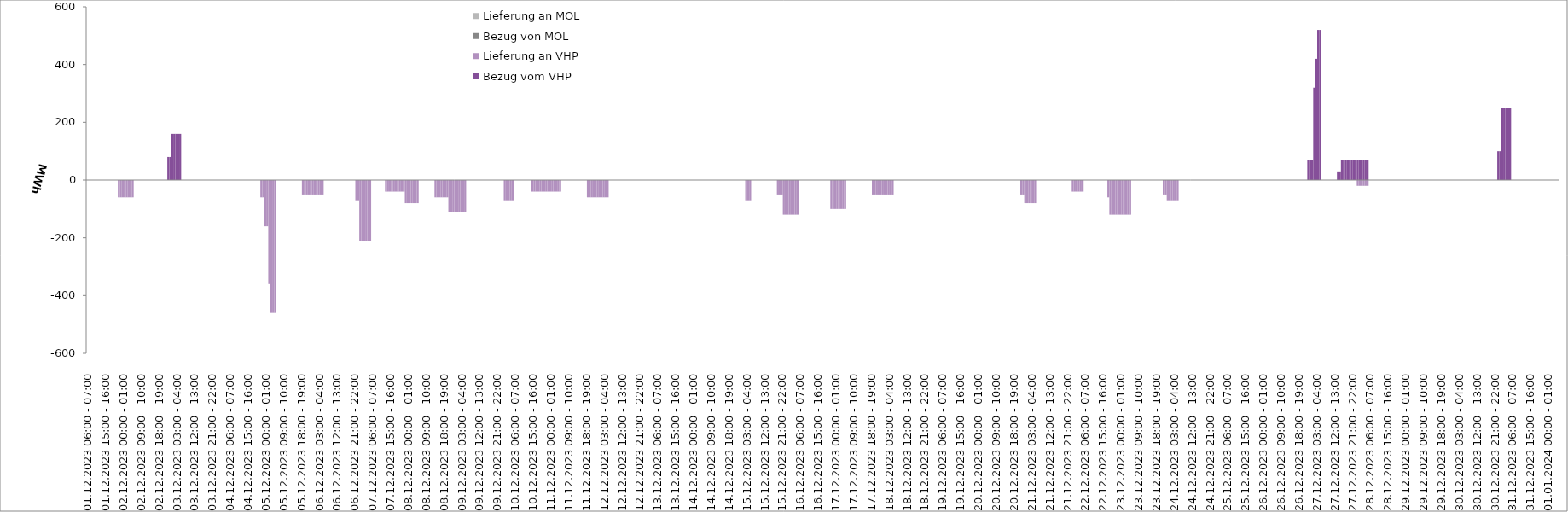
| Category | Bezug vom VHP | Lieferung an VHP | Bezug von MOL | Lieferung an MOL |
|---|---|---|---|---|
| 01.12.2023 06:00 - 07:00 | 0 | 0 | 0 | 0 |
| 01.12.2023 07:00 - 08:00 | 0 | 0 | 0 | 0 |
| 01.12.2023 08:00 - 09:00 | 0 | 0 | 0 | 0 |
| 01.12.2023 09:00 - 10:00 | 0 | 0 | 0 | 0 |
| 01.12.2023 10:00 - 11:00 | 0 | 0 | 0 | 0 |
| 01.12.2023 11:00 - 12:00 | 0 | 0 | 0 | 0 |
| 01.12.2023 12:00 - 13:00 | 0 | 0 | 0 | 0 |
| 01.12.2023 13:00 - 14:00 | 0 | 0 | 0 | 0 |
| 01.12.2023 14:00 - 15:00 | 0 | 0 | 0 | 0 |
| 01.12.2023 15:00 - 16:00 | 0 | 0 | 0 | 0 |
| 01.12.2023 16:00 - 17:00 | 0 | 0 | 0 | 0 |
| 01.12.2023 17:00 - 18:00 | 0 | 0 | 0 | 0 |
| 01.12.2023 18:00 - 19:00 | 0 | 0 | 0 | 0 |
| 01.12.2023 19:00 - 20:00 | 0 | 0 | 0 | 0 |
| 01.12.2023 20:00 - 21:00 | 0 | 0 | 0 | 0 |
| 01.12.2023 21:00 - 22:00 | 0 | 0 | 0 | 0 |
| 01.12.2023 22:00 - 23:00 | 0 | -60 | 0 | 0 |
| 01.12.2023 23:00 - 24:00 | 0 | -60 | 0 | 0 |
| 02.12.2023 00:00 - 01:00 | 0 | -60 | 0 | 0 |
| 02.12.2023 01:00 - 02:00 | 0 | -60 | 0 | 0 |
| 02.12.2023 02:00 - 03:00 | 0 | -60 | 0 | 0 |
| 02.12.2023 03:00 - 04:00 | 0 | -60 | 0 | 0 |
| 02.12.2023 04:00 - 05:00 | 0 | -60 | 0 | 0 |
| 02.12.2023 05:00 - 06:00 | 0 | -60 | 0 | 0 |
| 02.12.2023 06:00 - 07:00 | 0 | 0 | 0 | 0 |
| 02.12.2023 07:00 - 08:00 | 0 | 0 | 0 | 0 |
| 02.12.2023 08:00 - 09:00 | 0 | 0 | 0 | 0 |
| 02.12.2023 09:00 - 10:00 | 0 | 0 | 0 | 0 |
| 02.12.2023 10:00 - 11:00 | 0 | 0 | 0 | 0 |
| 02.12.2023 11:00 - 12:00 | 0 | 0 | 0 | 0 |
| 02.12.2023 12:00 - 13:00 | 0 | 0 | 0 | 0 |
| 02.12.2023 13:00 - 14:00 | 0 | 0 | 0 | 0 |
| 02.12.2023 14:00 - 15:00 | 0 | 0 | 0 | 0 |
| 02.12.2023 15:00 - 16:00 | 0 | 0 | 0 | 0 |
| 02.12.2023 16:00 - 17:00 | 0 | 0 | 0 | 0 |
| 02.12.2023 17:00 - 18:00 | 0 | 0 | 0 | 0 |
| 02.12.2023 18:00 - 19:00 | 0 | 0 | 0 | 0 |
| 02.12.2023 19:00 - 20:00 | 0 | 0 | 0 | 0 |
| 02.12.2023 20:00 - 21:00 | 0 | 0 | 0 | 0 |
| 02.12.2023 21:00 - 22:00 | 0 | 0 | 0 | 0 |
| 02.12.2023 22:00 - 23:00 | 0 | 0 | 0 | 0 |
| 02.12.2023 23:00 - 24:00 | 80 | 0 | 0 | 0 |
| 03.12.2023 00:00 - 01:00 | 80 | 0 | 0 | 0 |
| 03.12.2023 01:00 - 02:00 | 160 | 0 | 0 | 0 |
| 03.12.2023 02:00 - 03:00 | 160 | 0 | 0 | 0 |
| 03.12.2023 03:00 - 04:00 | 160 | 0 | 0 | 0 |
| 03.12.2023 04:00 - 05:00 | 160 | 0 | 0 | 0 |
| 03.12.2023 05:00 - 06:00 | 160 | 0 | 0 | 0 |
| 03.12.2023 06:00 - 07:00 | 0 | 0 | 0 | 0 |
| 03.12.2023 07:00 - 08:00 | 0 | 0 | 0 | 0 |
| 03.12.2023 08:00 - 09:00 | 0 | 0 | 0 | 0 |
| 03.12.2023 09:00 - 10:00 | 0 | 0 | 0 | 0 |
| 03.12.2023 10:00 - 11:00 | 0 | 0 | 0 | 0 |
| 03.12.2023 11:00 - 12:00 | 0 | 0 | 0 | 0 |
| 03.12.2023 12:00 - 13:00 | 0 | 0 | 0 | 0 |
| 03.12.2023 13:00 - 14:00 | 0 | 0 | 0 | 0 |
| 03.12.2023 14:00 - 15:00 | 0 | 0 | 0 | 0 |
| 03.12.2023 15:00 - 16:00 | 0 | 0 | 0 | 0 |
| 03.12.2023 16:00 - 17:00 | 0 | 0 | 0 | 0 |
| 03.12.2023 17:00 - 18:00 | 0 | 0 | 0 | 0 |
| 03.12.2023 18:00 - 19:00 | 0 | 0 | 0 | 0 |
| 03.12.2023 19:00 - 20:00 | 0 | 0 | 0 | 0 |
| 03.12.2023 20:00 - 21:00 | 0 | 0 | 0 | 0 |
| 03.12.2023 21:00 - 22:00 | 0 | 0 | 0 | 0 |
| 03.12.2023 22:00 - 23:00 | 0 | 0 | 0 | 0 |
| 03.12.2023 23:00 - 24:00 | 0 | 0 | 0 | 0 |
| 04.12.2023 00:00 - 01:00 | 0 | 0 | 0 | 0 |
| 04.12.2023 01:00 - 02:00 | 0 | 0 | 0 | 0 |
| 04.12.2023 02:00 - 03:00 | 0 | 0 | 0 | 0 |
| 04.12.2023 03:00 - 04:00 | 0 | 0 | 0 | 0 |
| 04.12.2023 04:00 - 05:00 | 0 | 0 | 0 | 0 |
| 04.12.2023 05:00 - 06:00 | 0 | 0 | 0 | 0 |
| 04.12.2023 06:00 - 07:00 | 0 | 0 | 0 | 0 |
| 04.12.2023 07:00 - 08:00 | 0 | 0 | 0 | 0 |
| 04.12.2023 08:00 - 09:00 | 0 | 0 | 0 | 0 |
| 04.12.2023 09:00 - 10:00 | 0 | 0 | 0 | 0 |
| 04.12.2023 10:00 - 11:00 | 0 | 0 | 0 | 0 |
| 04.12.2023 11:00 - 12:00 | 0 | 0 | 0 | 0 |
| 04.12.2023 12:00 - 13:00 | 0 | 0 | 0 | 0 |
| 04.12.2023 13:00 - 14:00 | 0 | 0 | 0 | 0 |
| 04.12.2023 14:00 - 15:00 | 0 | 0 | 0 | 0 |
| 04.12.2023 15:00 - 16:00 | 0 | 0 | 0 | 0 |
| 04.12.2023 16:00 - 17:00 | 0 | 0 | 0 | 0 |
| 04.12.2023 17:00 - 18:00 | 0 | 0 | 0 | 0 |
| 04.12.2023 18:00 - 19:00 | 0 | 0 | 0 | 0 |
| 04.12.2023 19:00 - 20:00 | 0 | 0 | 0 | 0 |
| 04.12.2023 20:00 - 21:00 | 0 | 0 | 0 | 0 |
| 04.12.2023 21:00 - 22:00 | 0 | 0 | 0 | 0 |
| 04.12.2023 22:00 - 23:00 | 0 | -60 | 0 | 0 |
| 04.12.2023 23:00 - 24:00 | 0 | -60 | 0 | 0 |
| 05.12.2023 00:00 - 01:00 | 0 | -160 | 0 | 0 |
| 05.12.2023 01:00 - 02:00 | 0 | -160 | 0 | 0 |
| 05.12.2023 02:00 - 03:00 | 0 | -360 | 0 | 0 |
| 05.12.2023 03:00 - 04:00 | 0 | -460 | 0 | 0 |
| 05.12.2023 04:00 - 05:00 | 0 | -460 | 0 | 0 |
| 05.12.2023 05:00 - 06:00 | 0 | -460 | 0 | 0 |
| 05.12.2023 06:00 - 07:00 | 0 | 0 | 0 | 0 |
| 05.12.2023 07:00 - 08:00 | 0 | 0 | 0 | 0 |
| 05.12.2023 08:00 - 09:00 | 0 | 0 | 0 | 0 |
| 05.12.2023 09:00 - 10:00 | 0 | 0 | 0 | 0 |
| 05.12.2023 10:00 - 11:00 | 0 | 0 | 0 | 0 |
| 05.12.2023 11:00 - 12:00 | 0 | 0 | 0 | 0 |
| 05.12.2023 12:00 - 13:00 | 0 | 0 | 0 | 0 |
| 05.12.2023 13:00 - 14:00 | 0 | 0 | 0 | 0 |
| 05.12.2023 14:00 - 15:00 | 0 | 0 | 0 | 0 |
| 05.12.2023 15:00 - 16:00 | 0 | 0 | 0 | 0 |
| 05.12.2023 16:00 - 17:00 | 0 | 0 | 0 | 0 |
| 05.12.2023 17:00 - 18:00 | 0 | 0 | 0 | 0 |
| 05.12.2023 18:00 - 19:00 | 0 | 0 | 0 | 0 |
| 05.12.2023 19:00 - 20:00 | 0 | -50 | 0 | 0 |
| 05.12.2023 20:00 - 21:00 | 0 | -50 | 0 | 0 |
| 05.12.2023 21:00 - 22:00 | 0 | -50 | 0 | 0 |
| 05.12.2023 22:00 - 23:00 | 0 | -50 | 0 | 0 |
| 05.12.2023 23:00 - 24:00 | 0 | -50 | 0 | 0 |
| 06.12.2023 00:00 - 01:00 | 0 | -50 | 0 | 0 |
| 06.12.2023 01:00 - 02:00 | 0 | -50 | 0 | 0 |
| 06.12.2023 02:00 - 03:00 | 0 | -50 | 0 | 0 |
| 06.12.2023 03:00 - 04:00 | 0 | -50 | 0 | 0 |
| 06.12.2023 04:00 - 05:00 | 0 | -50 | 0 | 0 |
| 06.12.2023 05:00 - 06:00 | 0 | -50 | 0 | 0 |
| 06.12.2023 06:00 - 07:00 | 0 | 0 | 0 | 0 |
| 06.12.2023 07:00 - 08:00 | 0 | 0 | 0 | 0 |
| 06.12.2023 08:00 - 09:00 | 0 | 0 | 0 | 0 |
| 06.12.2023 09:00 - 10:00 | 0 | 0 | 0 | 0 |
| 06.12.2023 10:00 - 11:00 | 0 | 0 | 0 | 0 |
| 06.12.2023 11:00 - 12:00 | 0 | 0 | 0 | 0 |
| 06.12.2023 12:00 - 13:00 | 0 | 0 | 0 | 0 |
| 06.12.2023 13:00 - 14:00 | 0 | 0 | 0 | 0 |
| 06.12.2023 14:00 - 15:00 | 0 | 0 | 0 | 0 |
| 06.12.2023 15:00 - 16:00 | 0 | 0 | 0 | 0 |
| 06.12.2023 16:00 - 17:00 | 0 | 0 | 0 | 0 |
| 06.12.2023 17:00 - 18:00 | 0 | 0 | 0 | 0 |
| 06.12.2023 18:00 - 19:00 | 0 | 0 | 0 | 0 |
| 06.12.2023 19:00 - 20:00 | 0 | 0 | 0 | 0 |
| 06.12.2023 20:00 - 21:00 | 0 | 0 | 0 | 0 |
| 06.12.2023 21:00 - 22:00 | 0 | 0 | 0 | 0 |
| 06.12.2023 22:00 - 23:00 | 0 | -70 | 0 | 0 |
| 06.12.2023 23:00 - 24:00 | 0 | -70 | 0 | 0 |
| 07.12.2023 00:00 - 01:00 | 0 | -210 | 0 | 0 |
| 07.12.2023 01:00 - 02:00 | 0 | -210 | 0 | 0 |
| 07.12.2023 02:00 - 03:00 | 0 | -210 | 0 | 0 |
| 07.12.2023 03:00 - 04:00 | 0 | -210 | 0 | 0 |
| 07.12.2023 04:00 - 05:00 | 0 | -210 | 0 | 0 |
| 07.12.2023 05:00 - 06:00 | 0 | -210 | 0 | 0 |
| 07.12.2023 06:00 - 07:00 | 0 | 0 | 0 | 0 |
| 07.12.2023 07:00 - 08:00 | 0 | 0 | 0 | 0 |
| 07.12.2023 08:00 - 09:00 | 0 | 0 | 0 | 0 |
| 07.12.2023 09:00 - 10:00 | 0 | 0 | 0 | 0 |
| 07.12.2023 10:00 - 11:00 | 0 | 0 | 0 | 0 |
| 07.12.2023 11:00 - 12:00 | 0 | 0 | 0 | 0 |
| 07.12.2023 12:00 - 13:00 | 0 | 0 | 0 | 0 |
| 07.12.2023 13:00 - 14:00 | 0 | -40 | 0 | 0 |
| 07.12.2023 14:00 - 15:00 | 0 | -40 | 0 | 0 |
| 07.12.2023 15:00 - 16:00 | 0 | -40 | 0 | 0 |
| 07.12.2023 16:00 - 17:00 | 0 | -40 | 0 | 0 |
| 07.12.2023 17:00 - 18:00 | 0 | -40 | 0 | 0 |
| 07.12.2023 18:00 - 19:00 | 0 | -40 | 0 | 0 |
| 07.12.2023 19:00 - 20:00 | 0 | -40 | 0 | 0 |
| 07.12.2023 20:00 - 21:00 | 0 | -40 | 0 | 0 |
| 07.12.2023 21:00 - 22:00 | 0 | -40 | 0 | 0 |
| 07.12.2023 22:00 - 23:00 | 0 | -40 | 0 | 0 |
| 07.12.2023 23:00 - 24:00 | 0 | -80 | 0 | 0 |
| 08.12.2023 00:00 - 01:00 | 0 | -80 | 0 | 0 |
| 08.12.2023 01:00 - 02:00 | 0 | -80 | 0 | 0 |
| 08.12.2023 02:00 - 03:00 | 0 | -80 | 0 | 0 |
| 08.12.2023 03:00 - 04:00 | 0 | -80 | 0 | 0 |
| 08.12.2023 04:00 - 05:00 | 0 | -80 | 0 | 0 |
| 08.12.2023 05:00 - 06:00 | 0 | -80 | 0 | 0 |
| 08.12.2023 06:00 - 07:00 | 0 | 0 | 0 | 0 |
| 08.12.2023 07:00 - 08:00 | 0 | 0 | 0 | 0 |
| 08.12.2023 08:00 - 09:00 | 0 | 0 | 0 | 0 |
| 08.12.2023 09:00 - 10:00 | 0 | 0 | 0 | 0 |
| 08.12.2023 10:00 - 11:00 | 0 | 0 | 0 | 0 |
| 08.12.2023 11:00 - 12:00 | 0 | 0 | 0 | 0 |
| 08.12.2023 12:00 - 13:00 | 0 | 0 | 0 | 0 |
| 08.12.2023 13:00 - 14:00 | 0 | 0 | 0 | 0 |
| 08.12.2023 14:00 - 15:00 | 0 | -60 | 0 | 0 |
| 08.12.2023 15:00 - 16:00 | 0 | -60 | 0 | 0 |
| 08.12.2023 16:00 - 17:00 | 0 | -60 | 0 | 0 |
| 08.12.2023 17:00 - 18:00 | 0 | -60 | 0 | 0 |
| 08.12.2023 18:00 - 19:00 | 0 | -60 | 0 | 0 |
| 08.12.2023 19:00 - 20:00 | 0 | -60 | 0 | 0 |
| 08.12.2023 20:00 - 21:00 | 0 | -60 | 0 | 0 |
| 08.12.2023 21:00 - 22:00 | 0 | -110 | 0 | 0 |
| 08.12.2023 22:00 - 23:00 | 0 | -110 | 0 | 0 |
| 08.12.2023 23:00 - 24:00 | 0 | -110 | 0 | 0 |
| 09.12.2023 00:00 - 01:00 | 0 | -110 | 0 | 0 |
| 09.12.2023 01:00 - 02:00 | 0 | -110 | 0 | 0 |
| 09.12.2023 02:00 - 03:00 | 0 | -110 | 0 | 0 |
| 09.12.2023 03:00 - 04:00 | 0 | -110 | 0 | 0 |
| 09.12.2023 04:00 - 05:00 | 0 | -110 | 0 | 0 |
| 09.12.2023 05:00 - 06:00 | 0 | -110 | 0 | 0 |
| 09.12.2023 06:00 - 07:00 | 0 | 0 | 0 | 0 |
| 09.12.2023 07:00 - 08:00 | 0 | 0 | 0 | 0 |
| 09.12.2023 08:00 - 09:00 | 0 | 0 | 0 | 0 |
| 09.12.2023 09:00 - 10:00 | 0 | 0 | 0 | 0 |
| 09.12.2023 10:00 - 11:00 | 0 | 0 | 0 | 0 |
| 09.12.2023 11:00 - 12:00 | 0 | 0 | 0 | 0 |
| 09.12.2023 12:00 - 13:00 | 0 | 0 | 0 | 0 |
| 09.12.2023 13:00 - 14:00 | 0 | 0 | 0 | 0 |
| 09.12.2023 14:00 - 15:00 | 0 | 0 | 0 | 0 |
| 09.12.2023 15:00 - 16:00 | 0 | 0 | 0 | 0 |
| 09.12.2023 16:00 - 17:00 | 0 | 0 | 0 | 0 |
| 09.12.2023 17:00 - 18:00 | 0 | 0 | 0 | 0 |
| 09.12.2023 18:00 - 19:00 | 0 | 0 | 0 | 0 |
| 09.12.2023 19:00 - 20:00 | 0 | 0 | 0 | 0 |
| 09.12.2023 20:00 - 21:00 | 0 | 0 | 0 | 0 |
| 09.12.2023 21:00 - 22:00 | 0 | 0 | 0 | 0 |
| 09.12.2023 22:00 - 23:00 | 0 | 0 | 0 | 0 |
| 09.12.2023 23:00 - 24:00 | 0 | 0 | 0 | 0 |
| 10.12.2023 00:00 - 01:00 | 0 | 0 | 0 | 0 |
| 10.12.2023 01:00 - 02:00 | 0 | -70 | 0 | 0 |
| 10.12.2023 02:00 - 03:00 | 0 | -70 | 0 | 0 |
| 10.12.2023 03:00 - 04:00 | 0 | -70 | 0 | 0 |
| 10.12.2023 04:00 - 05:00 | 0 | -70 | 0 | 0 |
| 10.12.2023 05:00 - 06:00 | 0 | -70 | 0 | 0 |
| 10.12.2023 06:00 - 07:00 | 0 | 0 | 0 | 0 |
| 10.12.2023 07:00 - 08:00 | 0 | 0 | 0 | 0 |
| 10.12.2023 08:00 - 09:00 | 0 | 0 | 0 | 0 |
| 10.12.2023 09:00 - 10:00 | 0 | 0 | 0 | 0 |
| 10.12.2023 10:00 - 11:00 | 0 | 0 | 0 | 0 |
| 10.12.2023 11:00 - 12:00 | 0 | 0 | 0 | 0 |
| 10.12.2023 12:00 - 13:00 | 0 | 0 | 0 | 0 |
| 10.12.2023 13:00 - 14:00 | 0 | 0 | 0 | 0 |
| 10.12.2023 14:00 - 15:00 | 0 | 0 | 0 | 0 |
| 10.12.2023 15:00 - 16:00 | 0 | -40 | 0 | 0 |
| 10.12.2023 16:00 - 17:00 | 0 | -40 | 0 | 0 |
| 10.12.2023 17:00 - 18:00 | 0 | -40 | 0 | 0 |
| 10.12.2023 18:00 - 19:00 | 0 | -40 | 0 | 0 |
| 10.12.2023 19:00 - 20:00 | 0 | -40 | 0 | 0 |
| 10.12.2023 20:00 - 21:00 | 0 | -40 | 0 | 0 |
| 10.12.2023 21:00 - 22:00 | 0 | -40 | 0 | 0 |
| 10.12.2023 22:00 - 23:00 | 0 | -40 | 0 | 0 |
| 10.12.2023 23:00 - 24:00 | 0 | -40 | 0 | 0 |
| 11.12.2023 00:00 - 01:00 | 0 | -40 | 0 | 0 |
| 11.12.2023 01:00 - 02:00 | 0 | -40 | 0 | 0 |
| 11.12.2023 02:00 - 03:00 | 0 | -40 | 0 | 0 |
| 11.12.2023 03:00 - 04:00 | 0 | -40 | 0 | 0 |
| 11.12.2023 04:00 - 05:00 | 0 | -40 | 0 | 0 |
| 11.12.2023 05:00 - 06:00 | 0 | -40 | 0 | 0 |
| 11.12.2023 06:00 - 07:00 | 0 | 0 | 0 | 0 |
| 11.12.2023 07:00 - 08:00 | 0 | 0 | 0 | 0 |
| 11.12.2023 08:00 - 09:00 | 0 | 0 | 0 | 0 |
| 11.12.2023 09:00 - 10:00 | 0 | 0 | 0 | 0 |
| 11.12.2023 10:00 - 11:00 | 0 | 0 | 0 | 0 |
| 11.12.2023 11:00 - 12:00 | 0 | 0 | 0 | 0 |
| 11.12.2023 12:00 - 13:00 | 0 | 0 | 0 | 0 |
| 11.12.2023 13:00 - 14:00 | 0 | 0 | 0 | 0 |
| 11.12.2023 14:00 - 15:00 | 0 | 0 | 0 | 0 |
| 11.12.2023 15:00 - 16:00 | 0 | 0 | 0 | 0 |
| 11.12.2023 16:00 - 17:00 | 0 | 0 | 0 | 0 |
| 11.12.2023 17:00 - 18:00 | 0 | 0 | 0 | 0 |
| 11.12.2023 18:00 - 19:00 | 0 | 0 | 0 | 0 |
| 11.12.2023 19:00 - 20:00 | 0 | -60 | 0 | 0 |
| 11.12.2023 20:00 - 21:00 | 0 | -60 | 0 | 0 |
| 11.12.2023 21:00 - 22:00 | 0 | -60 | 0 | 0 |
| 11.12.2023 22:00 - 23:00 | 0 | -60 | 0 | 0 |
| 11.12.2023 23:00 - 24:00 | 0 | -60 | 0 | 0 |
| 12.12.2023 00:00 - 01:00 | 0 | -60 | 0 | 0 |
| 12.12.2023 01:00 - 02:00 | 0 | -60 | 0 | 0 |
| 12.12.2023 02:00 - 03:00 | 0 | -60 | 0 | 0 |
| 12.12.2023 03:00 - 04:00 | 0 | -60 | 0 | 0 |
| 12.12.2023 04:00 - 05:00 | 0 | -60 | 0 | 0 |
| 12.12.2023 05:00 - 06:00 | 0 | -60 | 0 | 0 |
| 12.12.2023 06:00 - 07:00 | 0 | 0 | 0 | 0 |
| 12.12.2023 07:00 - 08:00 | 0 | 0 | 0 | 0 |
| 12.12.2023 08:00 - 09:00 | 0 | 0 | 0 | 0 |
| 12.12.2023 09:00 - 10:00 | 0 | 0 | 0 | 0 |
| 12.12.2023 10:00 - 11:00 | 0 | 0 | 0 | 0 |
| 12.12.2023 11:00 - 12:00 | 0 | 0 | 0 | 0 |
| 12.12.2023 12:00 - 13:00 | 0 | 0 | 0 | 0 |
| 12.12.2023 13:00 - 14:00 | 0 | 0 | 0 | 0 |
| 12.12.2023 14:00 - 15:00 | 0 | 0 | 0 | 0 |
| 12.12.2023 15:00 - 16:00 | 0 | 0 | 0 | 0 |
| 12.12.2023 16:00 - 17:00 | 0 | 0 | 0 | 0 |
| 12.12.2023 17:00 - 18:00 | 0 | 0 | 0 | 0 |
| 12.12.2023 18:00 - 19:00 | 0 | 0 | 0 | 0 |
| 12.12.2023 19:00 - 20:00 | 0 | 0 | 0 | 0 |
| 12.12.2023 20:00 - 21:00 | 0 | 0 | 0 | 0 |
| 12.12.2023 21:00 - 22:00 | 0 | 0 | 0 | 0 |
| 12.12.2023 22:00 - 23:00 | 0 | 0 | 0 | 0 |
| 12.12.2023 23:00 - 24:00 | 0 | 0 | 0 | 0 |
| 13.12.2023 00:00 - 01:00 | 0 | 0 | 0 | 0 |
| 13.12.2023 01:00 - 02:00 | 0 | 0 | 0 | 0 |
| 13.12.2023 02:00 - 03:00 | 0 | 0 | 0 | 0 |
| 13.12.2023 03:00 - 04:00 | 0 | 0 | 0 | 0 |
| 13.12.2023 04:00 - 05:00 | 0 | 0 | 0 | 0 |
| 13.12.2023 05:00 - 06:00 | 0 | 0 | 0 | 0 |
| 13.12.2023 06:00 - 07:00 | 0 | 0 | 0 | 0 |
| 13.12.2023 07:00 - 08:00 | 0 | 0 | 0 | 0 |
| 13.12.2023 08:00 - 09:00 | 0 | 0 | 0 | 0 |
| 13.12.2023 09:00 - 10:00 | 0 | 0 | 0 | 0 |
| 13.12.2023 10:00 - 11:00 | 0 | 0 | 0 | 0 |
| 13.12.2023 11:00 - 12:00 | 0 | 0 | 0 | 0 |
| 13.12.2023 12:00 - 13:00 | 0 | 0 | 0 | 0 |
| 13.12.2023 13:00 - 14:00 | 0 | 0 | 0 | 0 |
| 13.12.2023 14:00 - 15:00 | 0 | 0 | 0 | 0 |
| 13.12.2023 15:00 - 16:00 | 0 | 0 | 0 | 0 |
| 13.12.2023 16:00 - 17:00 | 0 | 0 | 0 | 0 |
| 13.12.2023 17:00 - 18:00 | 0 | 0 | 0 | 0 |
| 13.12.2023 18:00 - 19:00 | 0 | 0 | 0 | 0 |
| 13.12.2023 19:00 - 20:00 | 0 | 0 | 0 | 0 |
| 13.12.2023 20:00 - 21:00 | 0 | 0 | 0 | 0 |
| 13.12.2023 21:00 - 22:00 | 0 | 0 | 0 | 0 |
| 13.12.2023 22:00 - 23:00 | 0 | 0 | 0 | 0 |
| 13.12.2023 23:00 - 24:00 | 0 | 0 | 0 | 0 |
| 14.12.2023 00:00 - 01:00 | 0 | 0 | 0 | 0 |
| 14.12.2023 01:00 - 02:00 | 0 | 0 | 0 | 0 |
| 14.12.2023 02:00 - 03:00 | 0 | 0 | 0 | 0 |
| 14.12.2023 03:00 - 04:00 | 0 | 0 | 0 | 0 |
| 14.12.2023 04:00 - 05:00 | 0 | 0 | 0 | 0 |
| 14.12.2023 05:00 - 06:00 | 0 | 0 | 0 | 0 |
| 14.12.2023 06:00 - 07:00 | 0 | 0 | 0 | 0 |
| 14.12.2023 07:00 - 08:00 | 0 | 0 | 0 | 0 |
| 14.12.2023 08:00 - 09:00 | 0 | 0 | 0 | 0 |
| 14.12.2023 09:00 - 10:00 | 0 | 0 | 0 | 0 |
| 14.12.2023 10:00 - 11:00 | 0 | 0 | 0 | 0 |
| 14.12.2023 11:00 - 12:00 | 0 | 0 | 0 | 0 |
| 14.12.2023 12:00 - 13:00 | 0 | 0 | 0 | 0 |
| 14.12.2023 13:00 - 14:00 | 0 | 0 | 0 | 0 |
| 14.12.2023 14:00 - 15:00 | 0 | 0 | 0 | 0 |
| 14.12.2023 15:00 - 16:00 | 0 | 0 | 0 | 0 |
| 14.12.2023 16:00 - 17:00 | 0 | 0 | 0 | 0 |
| 14.12.2023 17:00 - 18:00 | 0 | 0 | 0 | 0 |
| 14.12.2023 18:00 - 19:00 | 0 | 0 | 0 | 0 |
| 14.12.2023 19:00 - 20:00 | 0 | 0 | 0 | 0 |
| 14.12.2023 20:00 - 21:00 | 0 | 0 | 0 | 0 |
| 14.12.2023 21:00 - 22:00 | 0 | 0 | 0 | 0 |
| 14.12.2023 22:00 - 23:00 | 0 | 0 | 0 | 0 |
| 14.12.2023 23:00 - 24:00 | 0 | 0 | 0 | 0 |
| 15.12.2023 00:00 - 01:00 | 0 | 0 | 0 | 0 |
| 15.12.2023 01:00 - 02:00 | 0 | 0 | 0 | 0 |
| 15.12.2023 02:00 - 03:00 | 0 | 0 | 0 | 0 |
| 15.12.2023 03:00 - 04:00 | 0 | -70 | 0 | 0 |
| 15.12.2023 04:00 - 05:00 | 0 | -70 | 0 | 0 |
| 15.12.2023 05:00 - 06:00 | 0 | -70 | 0 | 0 |
| 15.12.2023 06:00 - 07:00 | 0 | 0 | 0 | 0 |
| 15.12.2023 07:00 - 08:00 | 0 | 0 | 0 | 0 |
| 15.12.2023 08:00 - 09:00 | 0 | 0 | 0 | 0 |
| 15.12.2023 09:00 - 10:00 | 0 | 0 | 0 | 0 |
| 15.12.2023 10:00 - 11:00 | 0 | 0 | 0 | 0 |
| 15.12.2023 11:00 - 12:00 | 0 | 0 | 0 | 0 |
| 15.12.2023 12:00 - 13:00 | 0 | 0 | 0 | 0 |
| 15.12.2023 13:00 - 14:00 | 0 | 0 | 0 | 0 |
| 15.12.2023 14:00 - 15:00 | 0 | 0 | 0 | 0 |
| 15.12.2023 15:00 - 16:00 | 0 | 0 | 0 | 0 |
| 15.12.2023 16:00 - 17:00 | 0 | 0 | 0 | 0 |
| 15.12.2023 17:00 - 18:00 | 0 | 0 | 0 | 0 |
| 15.12.2023 18:00 - 19:00 | 0 | 0 | 0 | 0 |
| 15.12.2023 19:00 - 20:00 | 0 | -50 | 0 | 0 |
| 15.12.2023 20:00 - 21:00 | 0 | -50 | 0 | 0 |
| 15.12.2023 21:00 - 22:00 | 0 | -50 | 0 | 0 |
| 15.12.2023 22:00 - 23:00 | 0 | -120 | 0 | 0 |
| 15.12.2023 23:00 - 24:00 | 0 | -120 | 0 | 0 |
| 16.12.2023 00:00 - 01:00 | 0 | -120 | 0 | 0 |
| 16.12.2023 01:00 - 02:00 | 0 | -120 | 0 | 0 |
| 16.12.2023 02:00 - 03:00 | 0 | -120 | 0 | 0 |
| 16.12.2023 03:00 - 04:00 | 0 | -120 | 0 | 0 |
| 16.12.2023 04:00 - 05:00 | 0 | -120 | 0 | 0 |
| 16.12.2023 05:00 - 06:00 | 0 | -120 | 0 | 0 |
| 16.12.2023 06:00 - 07:00 | 0 | 0 | 0 | 0 |
| 16.12.2023 07:00 - 08:00 | 0 | 0 | 0 | 0 |
| 16.12.2023 08:00 - 09:00 | 0 | 0 | 0 | 0 |
| 16.12.2023 09:00 - 10:00 | 0 | 0 | 0 | 0 |
| 16.12.2023 10:00 - 11:00 | 0 | 0 | 0 | 0 |
| 16.12.2023 11:00 - 12:00 | 0 | 0 | 0 | 0 |
| 16.12.2023 12:00 - 13:00 | 0 | 0 | 0 | 0 |
| 16.12.2023 13:00 - 14:00 | 0 | 0 | 0 | 0 |
| 16.12.2023 14:00 - 15:00 | 0 | 0 | 0 | 0 |
| 16.12.2023 15:00 - 16:00 | 0 | 0 | 0 | 0 |
| 16.12.2023 16:00 - 17:00 | 0 | 0 | 0 | 0 |
| 16.12.2023 17:00 - 18:00 | 0 | 0 | 0 | 0 |
| 16.12.2023 18:00 - 19:00 | 0 | 0 | 0 | 0 |
| 16.12.2023 19:00 - 20:00 | 0 | 0 | 0 | 0 |
| 16.12.2023 20:00 - 21:00 | 0 | 0 | 0 | 0 |
| 16.12.2023 21:00 - 22:00 | 0 | 0 | 0 | 0 |
| 16.12.2023 22:00 - 23:00 | 0 | -100 | 0 | 0 |
| 16.12.2023 23:00 - 24:00 | 0 | -100 | 0 | 0 |
| 17.12.2023 00:00 - 01:00 | 0 | -100 | 0 | 0 |
| 17.12.2023 01:00 - 02:00 | 0 | -100 | 0 | 0 |
| 17.12.2023 02:00 - 03:00 | 0 | -100 | 0 | 0 |
| 17.12.2023 03:00 - 04:00 | 0 | -100 | 0 | 0 |
| 17.12.2023 04:00 - 05:00 | 0 | -100 | 0 | 0 |
| 17.12.2023 05:00 - 06:00 | 0 | -100 | 0 | 0 |
| 17.12.2023 06:00 - 07:00 | 0 | 0 | 0 | 0 |
| 17.12.2023 07:00 - 08:00 | 0 | 0 | 0 | 0 |
| 17.12.2023 08:00 - 09:00 | 0 | 0 | 0 | 0 |
| 17.12.2023 09:00 - 10:00 | 0 | 0 | 0 | 0 |
| 17.12.2023 10:00 - 11:00 | 0 | 0 | 0 | 0 |
| 17.12.2023 11:00 - 12:00 | 0 | 0 | 0 | 0 |
| 17.12.2023 12:00 - 13:00 | 0 | 0 | 0 | 0 |
| 17.12.2023 13:00 - 14:00 | 0 | 0 | 0 | 0 |
| 17.12.2023 14:00 - 15:00 | 0 | 0 | 0 | 0 |
| 17.12.2023 15:00 - 16:00 | 0 | 0 | 0 | 0 |
| 17.12.2023 16:00 - 17:00 | 0 | 0 | 0 | 0 |
| 17.12.2023 17:00 - 18:00 | 0 | 0 | 0 | 0 |
| 17.12.2023 18:00 - 19:00 | 0 | 0 | 0 | 0 |
| 17.12.2023 19:00 - 20:00 | 0 | -50 | 0 | 0 |
| 17.12.2023 20:00 - 21:00 | 0 | -50 | 0 | 0 |
| 17.12.2023 21:00 - 22:00 | 0 | -50 | 0 | 0 |
| 17.12.2023 22:00 - 23:00 | 0 | -50 | 0 | 0 |
| 17.12.2023 23:00 - 24:00 | 0 | -50 | 0 | 0 |
| 18.12.2023 00:00 - 01:00 | 0 | -50 | 0 | 0 |
| 18.12.2023 01:00 - 02:00 | 0 | -50 | 0 | 0 |
| 18.12.2023 02:00 - 03:00 | 0 | -50 | 0 | 0 |
| 18.12.2023 03:00 - 04:00 | 0 | -50 | 0 | 0 |
| 18.12.2023 04:00 - 05:00 | 0 | -50 | 0 | 0 |
| 18.12.2023 05:00 - 06:00 | 0 | -50 | 0 | 0 |
| 18.12.2023 06:00 - 07:00 | 0 | 0 | 0 | 0 |
| 18.12.2023 07:00 - 08:00 | 0 | 0 | 0 | 0 |
| 18.12.2023 08:00 - 09:00 | 0 | 0 | 0 | 0 |
| 18.12.2023 09:00 - 10:00 | 0 | 0 | 0 | 0 |
| 18.12.2023 10:00 - 11:00 | 0 | 0 | 0 | 0 |
| 18.12.2023 11:00 - 12:00 | 0 | 0 | 0 | 0 |
| 18.12.2023 12:00 - 13:00 | 0 | 0 | 0 | 0 |
| 18.12.2023 13:00 - 14:00 | 0 | 0 | 0 | 0 |
| 18.12.2023 14:00 - 15:00 | 0 | 0 | 0 | 0 |
| 18.12.2023 15:00 - 16:00 | 0 | 0 | 0 | 0 |
| 18.12.2023 16:00 - 17:00 | 0 | 0 | 0 | 0 |
| 18.12.2023 17:00 - 18:00 | 0 | 0 | 0 | 0 |
| 18.12.2023 18:00 - 19:00 | 0 | 0 | 0 | 0 |
| 18.12.2023 19:00 - 20:00 | 0 | 0 | 0 | 0 |
| 18.12.2023 20:00 - 21:00 | 0 | 0 | 0 | 0 |
| 18.12.2023 21:00 - 22:00 | 0 | 0 | 0 | 0 |
| 18.12.2023 22:00 - 23:00 | 0 | 0 | 0 | 0 |
| 18.12.2023 23:00 - 24:00 | 0 | 0 | 0 | 0 |
| 19.12.2023 00:00 - 01:00 | 0 | 0 | 0 | 0 |
| 19.12.2023 01:00 - 02:00 | 0 | 0 | 0 | 0 |
| 19.12.2023 02:00 - 03:00 | 0 | 0 | 0 | 0 |
| 19.12.2023 03:00 - 04:00 | 0 | 0 | 0 | 0 |
| 19.12.2023 04:00 - 05:00 | 0 | 0 | 0 | 0 |
| 19.12.2023 05:00 - 06:00 | 0 | 0 | 0 | 0 |
| 19.12.2023 06:00 - 07:00 | 0 | 0 | 0 | 0 |
| 19.12.2023 07:00 - 08:00 | 0 | 0 | 0 | 0 |
| 19.12.2023 08:00 - 09:00 | 0 | 0 | 0 | 0 |
| 19.12.2023 09:00 - 10:00 | 0 | 0 | 0 | 0 |
| 19.12.2023 10:00 - 11:00 | 0 | 0 | 0 | 0 |
| 19.12.2023 11:00 - 12:00 | 0 | 0 | 0 | 0 |
| 19.12.2023 12:00 - 13:00 | 0 | 0 | 0 | 0 |
| 19.12.2023 13:00 - 14:00 | 0 | 0 | 0 | 0 |
| 19.12.2023 14:00 - 15:00 | 0 | 0 | 0 | 0 |
| 19.12.2023 15:00 - 16:00 | 0 | 0 | 0 | 0 |
| 19.12.2023 16:00 - 17:00 | 0 | 0 | 0 | 0 |
| 19.12.2023 17:00 - 18:00 | 0 | 0 | 0 | 0 |
| 19.12.2023 18:00 - 19:00 | 0 | 0 | 0 | 0 |
| 19.12.2023 19:00 - 20:00 | 0 | 0 | 0 | 0 |
| 19.12.2023 20:00 - 21:00 | 0 | 0 | 0 | 0 |
| 19.12.2023 21:00 - 22:00 | 0 | 0 | 0 | 0 |
| 19.12.2023 22:00 - 23:00 | 0 | 0 | 0 | 0 |
| 19.12.2023 23:00 - 24:00 | 0 | 0 | 0 | 0 |
| 20.12.2023 00:00 - 01:00 | 0 | 0 | 0 | 0 |
| 20.12.2023 01:00 - 02:00 | 0 | 0 | 0 | 0 |
| 20.12.2023 02:00 - 03:00 | 0 | 0 | 0 | 0 |
| 20.12.2023 03:00 - 04:00 | 0 | 0 | 0 | 0 |
| 20.12.2023 04:00 - 05:00 | 0 | 0 | 0 | 0 |
| 20.12.2023 05:00 - 06:00 | 0 | 0 | 0 | 0 |
| 20.12.2023 06:00 - 07:00 | 0 | 0 | 0 | 0 |
| 20.12.2023 07:00 - 08:00 | 0 | 0 | 0 | 0 |
| 20.12.2023 08:00 - 09:00 | 0 | 0 | 0 | 0 |
| 20.12.2023 09:00 - 10:00 | 0 | 0 | 0 | 0 |
| 20.12.2023 10:00 - 11:00 | 0 | 0 | 0 | 0 |
| 20.12.2023 11:00 - 12:00 | 0 | 0 | 0 | 0 |
| 20.12.2023 12:00 - 13:00 | 0 | 0 | 0 | 0 |
| 20.12.2023 13:00 - 14:00 | 0 | 0 | 0 | 0 |
| 20.12.2023 14:00 - 15:00 | 0 | 0 | 0 | 0 |
| 20.12.2023 15:00 - 16:00 | 0 | 0 | 0 | 0 |
| 20.12.2023 16:00 - 17:00 | 0 | 0 | 0 | 0 |
| 20.12.2023 17:00 - 18:00 | 0 | 0 | 0 | 0 |
| 20.12.2023 18:00 - 19:00 | 0 | 0 | 0 | 0 |
| 20.12.2023 19:00 - 20:00 | 0 | 0 | 0 | 0 |
| 20.12.2023 20:00 - 21:00 | 0 | 0 | 0 | 0 |
| 20.12.2023 21:00 - 22:00 | 0 | 0 | 0 | 0 |
| 20.12.2023 22:00 - 23:00 | 0 | -50 | 0 | 0 |
| 20.12.2023 23:00 - 24:00 | 0 | -50 | 0 | 0 |
| 21.12.2023 00:00 - 01:00 | 0 | -80 | 0 | 0 |
| 21.12.2023 01:00 - 02:00 | 0 | -80 | 0 | 0 |
| 21.12.2023 02:00 - 03:00 | 0 | -80 | 0 | 0 |
| 21.12.2023 03:00 - 04:00 | 0 | -80 | 0 | 0 |
| 21.12.2023 04:00 - 05:00 | 0 | -80 | 0 | 0 |
| 21.12.2023 05:00 - 06:00 | 0 | -80 | 0 | 0 |
| 21.12.2023 06:00 - 07:00 | 0 | 0 | 0 | 0 |
| 21.12.2023 07:00 - 08:00 | 0 | 0 | 0 | 0 |
| 21.12.2023 08:00 - 09:00 | 0 | 0 | 0 | 0 |
| 21.12.2023 09:00 - 10:00 | 0 | 0 | 0 | 0 |
| 21.12.2023 10:00 - 11:00 | 0 | 0 | 0 | 0 |
| 21.12.2023 11:00 - 12:00 | 0 | 0 | 0 | 0 |
| 21.12.2023 12:00 - 13:00 | 0 | 0 | 0 | 0 |
| 21.12.2023 13:00 - 14:00 | 0 | 0 | 0 | 0 |
| 21.12.2023 14:00 - 15:00 | 0 | 0 | 0 | 0 |
| 21.12.2023 15:00 - 16:00 | 0 | 0 | 0 | 0 |
| 21.12.2023 16:00 - 17:00 | 0 | 0 | 0 | 0 |
| 21.12.2023 17:00 - 18:00 | 0 | 0 | 0 | 0 |
| 21.12.2023 18:00 - 19:00 | 0 | 0 | 0 | 0 |
| 21.12.2023 19:00 - 20:00 | 0 | 0 | 0 | 0 |
| 21.12.2023 20:00 - 21:00 | 0 | 0 | 0 | 0 |
| 21.12.2023 21:00 - 22:00 | 0 | 0 | 0 | 0 |
| 21.12.2023 22:00 - 23:00 | 0 | 0 | 0 | 0 |
| 21.12.2023 23:00 - 24:00 | 0 | 0 | 0 | 0 |
| 22.12.2023 00:00 - 01:00 | 0 | -40 | 0 | 0 |
| 22.12.2023 01:00 - 02:00 | 0 | -40 | 0 | 0 |
| 22.12.2023 02:00 - 03:00 | 0 | -40 | 0 | 0 |
| 22.12.2023 03:00 - 04:00 | 0 | -40 | 0 | 0 |
| 22.12.2023 04:00 - 05:00 | 0 | -40 | 0 | 0 |
| 22.12.2023 05:00 - 06:00 | 0 | -40 | 0 | 0 |
| 22.12.2023 06:00 - 07:00 | 0 | 0 | 0 | 0 |
| 22.12.2023 07:00 - 08:00 | 0 | 0 | 0 | 0 |
| 22.12.2023 08:00 - 09:00 | 0 | 0 | 0 | 0 |
| 22.12.2023 09:00 - 10:00 | 0 | 0 | 0 | 0 |
| 22.12.2023 10:00 - 11:00 | 0 | 0 | 0 | 0 |
| 22.12.2023 11:00 - 12:00 | 0 | 0 | 0 | 0 |
| 22.12.2023 12:00 - 13:00 | 0 | 0 | 0 | 0 |
| 22.12.2023 13:00 - 14:00 | 0 | 0 | 0 | 0 |
| 22.12.2023 14:00 - 15:00 | 0 | 0 | 0 | 0 |
| 22.12.2023 15:00 - 16:00 | 0 | 0 | 0 | 0 |
| 22.12.2023 16:00 - 17:00 | 0 | 0 | 0 | 0 |
| 22.12.2023 17:00 - 18:00 | 0 | 0 | 0 | 0 |
| 22.12.2023 18:00 - 19:00 | 0 | -60 | 0 | 0 |
| 22.12.2023 19:00 - 20:00 | 0 | -120 | 0 | 0 |
| 22.12.2023 20:00 - 21:00 | 0 | -120 | 0 | 0 |
| 22.12.2023 21:00 - 22:00 | 0 | -120 | 0 | 0 |
| 22.12.2023 22:00 - 23:00 | 0 | -120 | 0 | 0 |
| 22.12.2023 23:00 - 24:00 | 0 | -120 | 0 | 0 |
| 23.12.2023 00:00 - 01:00 | 0 | -120 | 0 | 0 |
| 23.12.2023 01:00 - 02:00 | 0 | -120 | 0 | 0 |
| 23.12.2023 02:00 - 03:00 | 0 | -120 | 0 | 0 |
| 23.12.2023 03:00 - 04:00 | 0 | -120 | 0 | 0 |
| 23.12.2023 04:00 - 05:00 | 0 | -120 | 0 | 0 |
| 23.12.2023 05:00 - 06:00 | 0 | -120 | 0 | 0 |
| 23.12.2023 06:00 - 07:00 | 0 | 0 | 0 | 0 |
| 23.12.2023 07:00 - 08:00 | 0 | 0 | 0 | 0 |
| 23.12.2023 08:00 - 09:00 | 0 | 0 | 0 | 0 |
| 23.12.2023 09:00 - 10:00 | 0 | 0 | 0 | 0 |
| 23.12.2023 10:00 - 11:00 | 0 | 0 | 0 | 0 |
| 23.12.2023 11:00 - 12:00 | 0 | 0 | 0 | 0 |
| 23.12.2023 12:00 - 13:00 | 0 | 0 | 0 | 0 |
| 23.12.2023 13:00 - 14:00 | 0 | 0 | 0 | 0 |
| 23.12.2023 14:00 - 15:00 | 0 | 0 | 0 | 0 |
| 23.12.2023 15:00 - 16:00 | 0 | 0 | 0 | 0 |
| 23.12.2023 16:00 - 17:00 | 0 | 0 | 0 | 0 |
| 23.12.2023 17:00 - 18:00 | 0 | 0 | 0 | 0 |
| 23.12.2023 18:00 - 19:00 | 0 | 0 | 0 | 0 |
| 23.12.2023 19:00 - 20:00 | 0 | 0 | 0 | 0 |
| 23.12.2023 20:00 - 21:00 | 0 | 0 | 0 | 0 |
| 23.12.2023 21:00 - 22:00 | 0 | 0 | 0 | 0 |
| 23.12.2023 22:00 - 23:00 | 0 | -50 | 0 | 0 |
| 23.12.2023 23:00 - 24:00 | 0 | -50 | 0 | 0 |
| 24.12.2023 00:00 - 01:00 | 0 | -70 | 0 | 0 |
| 24.12.2023 01:00 - 02:00 | 0 | -70 | 0 | 0 |
| 24.12.2023 02:00 - 03:00 | 0 | -70 | 0 | 0 |
| 24.12.2023 03:00 - 04:00 | 0 | -70 | 0 | 0 |
| 24.12.2023 04:00 - 05:00 | 0 | -70 | 0 | 0 |
| 24.12.2023 05:00 - 06:00 | 0 | -70 | 0 | 0 |
| 24.12.2023 06:00 - 07:00 | 0 | 0 | 0 | 0 |
| 24.12.2023 07:00 - 08:00 | 0 | 0 | 0 | 0 |
| 24.12.2023 08:00 - 09:00 | 0 | 0 | 0 | 0 |
| 24.12.2023 09:00 - 10:00 | 0 | 0 | 0 | 0 |
| 24.12.2023 10:00 - 11:00 | 0 | 0 | 0 | 0 |
| 24.12.2023 11:00 - 12:00 | 0 | 0 | 0 | 0 |
| 24.12.2023 12:00 - 13:00 | 0 | 0 | 0 | 0 |
| 24.12.2023 13:00 - 14:00 | 0 | 0 | 0 | 0 |
| 24.12.2023 14:00 - 15:00 | 0 | 0 | 0 | 0 |
| 24.12.2023 15:00 - 16:00 | 0 | 0 | 0 | 0 |
| 24.12.2023 16:00 - 17:00 | 0 | 0 | 0 | 0 |
| 24.12.2023 17:00 - 18:00 | 0 | 0 | 0 | 0 |
| 24.12.2023 18:00 - 19:00 | 0 | 0 | 0 | 0 |
| 24.12.2023 19:00 - 20:00 | 0 | 0 | 0 | 0 |
| 24.12.2023 20:00 - 21:00 | 0 | 0 | 0 | 0 |
| 24.12.2023 21:00 - 22:00 | 0 | 0 | 0 | 0 |
| 24.12.2023 22:00 - 23:00 | 0 | 0 | 0 | 0 |
| 24.12.2023 23:00 - 24:00 | 0 | 0 | 0 | 0 |
| 25.12.2023 00:00 - 01:00 | 0 | 0 | 0 | 0 |
| 25.12.2023 01:00 - 02:00 | 0 | 0 | 0 | 0 |
| 25.12.2023 02:00 - 03:00 | 0 | 0 | 0 | 0 |
| 25.12.2023 03:00 - 04:00 | 0 | 0 | 0 | 0 |
| 25.12.2023 04:00 - 05:00 | 0 | 0 | 0 | 0 |
| 25.12.2023 05:00 - 06:00 | 0 | 0 | 0 | 0 |
| 25.12.2023 06:00 - 07:00 | 0 | 0 | 0 | 0 |
| 25.12.2023 07:00 - 08:00 | 0 | 0 | 0 | 0 |
| 25.12.2023 08:00 - 09:00 | 0 | 0 | 0 | 0 |
| 25.12.2023 09:00 - 10:00 | 0 | 0 | 0 | 0 |
| 25.12.2023 10:00 - 11:00 | 0 | 0 | 0 | 0 |
| 25.12.2023 11:00 - 12:00 | 0 | 0 | 0 | 0 |
| 25.12.2023 12:00 - 13:00 | 0 | 0 | 0 | 0 |
| 25.12.2023 13:00 - 14:00 | 0 | 0 | 0 | 0 |
| 25.12.2023 14:00 - 15:00 | 0 | 0 | 0 | 0 |
| 25.12.2023 15:00 - 16:00 | 0 | 0 | 0 | 0 |
| 25.12.2023 16:00 - 17:00 | 0 | 0 | 0 | 0 |
| 25.12.2023 17:00 - 18:00 | 0 | 0 | 0 | 0 |
| 25.12.2023 18:00 - 19:00 | 0 | 0 | 0 | 0 |
| 25.12.2023 19:00 - 20:00 | 0 | 0 | 0 | 0 |
| 25.12.2023 20:00 - 21:00 | 0 | 0 | 0 | 0 |
| 25.12.2023 21:00 - 22:00 | 0 | 0 | 0 | 0 |
| 25.12.2023 22:00 - 23:00 | 0 | 0 | 0 | 0 |
| 25.12.2023 23:00 - 24:00 | 0 | 0 | 0 | 0 |
| 26.12.2023 00:00 - 01:00 | 0 | 0 | 0 | 0 |
| 26.12.2023 01:00 - 02:00 | 0 | 0 | 0 | 0 |
| 26.12.2023 02:00 - 03:00 | 0 | 0 | 0 | 0 |
| 26.12.2023 03:00 - 04:00 | 0 | 0 | 0 | 0 |
| 26.12.2023 04:00 - 05:00 | 0 | 0 | 0 | 0 |
| 26.12.2023 05:00 - 06:00 | 0 | 0 | 0 | 0 |
| 26.12.2023 06:00 - 07:00 | 0 | 0 | 0 | 0 |
| 26.12.2023 07:00 - 08:00 | 0 | 0 | 0 | 0 |
| 26.12.2023 08:00 - 09:00 | 0 | 0 | 0 | 0 |
| 26.12.2023 09:00 - 10:00 | 0 | 0 | 0 | 0 |
| 26.12.2023 10:00 - 11:00 | 0 | 0 | 0 | 0 |
| 26.12.2023 11:00 - 12:00 | 0 | 0 | 0 | 0 |
| 26.12.2023 12:00 - 13:00 | 0 | 0 | 0 | 0 |
| 26.12.2023 13:00 - 14:00 | 0 | 0 | 0 | 0 |
| 26.12.2023 14:00 - 15:00 | 0 | 0 | 0 | 0 |
| 26.12.2023 15:00 - 16:00 | 0 | 0 | 0 | 0 |
| 26.12.2023 16:00 - 17:00 | 0 | 0 | 0 | 0 |
| 26.12.2023 17:00 - 18:00 | 0 | 0 | 0 | 0 |
| 26.12.2023 18:00 - 19:00 | 0 | 0 | 0 | 0 |
| 26.12.2023 19:00 - 20:00 | 0 | 0 | 0 | 0 |
| 26.12.2023 20:00 - 21:00 | 0 | 0 | 0 | 0 |
| 26.12.2023 21:00 - 22:00 | 0 | 0 | 0 | 0 |
| 26.12.2023 22:00 - 23:00 | 0 | 0 | 0 | 0 |
| 26.12.2023 23:00 - 24:00 | 70 | 0 | 0 | 0 |
| 27.12.2023 00:00 - 01:00 | 70 | 0 | 0 | 0 |
| 27.12.2023 01:00 - 02:00 | 70 | 0 | 0 | 0 |
| 27.12.2023 02:00 - 03:00 | 320 | 0 | 0 | 0 |
| 27.12.2023 03:00 - 04:00 | 420 | 0 | 0 | 0 |
| 27.12.2023 04:00 - 05:00 | 520 | 0 | 0 | 0 |
| 27.12.2023 05:00 - 06:00 | 520 | 0 | 0 | 0 |
| 27.12.2023 06:00 - 07:00 | 0 | 0 | 0 | 0 |
| 27.12.2023 07:00 - 08:00 | 0 | 0 | 0 | 0 |
| 27.12.2023 08:00 - 09:00 | 0 | 0 | 0 | 0 |
| 27.12.2023 09:00 - 10:00 | 0 | 0 | 0 | 0 |
| 27.12.2023 10:00 - 11:00 | 0 | 0 | 0 | 0 |
| 27.12.2023 11:00 - 12:00 | 0 | 0 | 0 | 0 |
| 27.12.2023 12:00 - 13:00 | 0 | 0 | 0 | 0 |
| 27.12.2023 13:00 - 14:00 | 0 | 0 | 0 | 0 |
| 27.12.2023 14:00 - 15:00 | 30 | 0 | 0 | 0 |
| 27.12.2023 15:00 - 16:00 | 30 | 0 | 0 | 0 |
| 27.12.2023 16:00 - 17:00 | 70 | 0 | 0 | 0 |
| 27.12.2023 17:00 - 18:00 | 70 | 0 | 0 | 0 |
| 27.12.2023 18:00 - 19:00 | 70 | 0 | 0 | 0 |
| 27.12.2023 19:00 - 20:00 | 70 | 0 | 0 | 0 |
| 27.12.2023 20:00 - 21:00 | 70 | 0 | 0 | 0 |
| 27.12.2023 21:00 - 22:00 | 70 | 0 | 0 | 0 |
| 27.12.2023 22:00 - 23:00 | 70 | 0 | 0 | 0 |
| 27.12.2023 23:00 - 24:00 | 70 | 0 | 0 | 0 |
| 28.12.2023 00:00 - 01:00 | 70 | -20 | 0 | 0 |
| 28.12.2023 01:00 - 02:00 | 70 | -20 | 0 | 0 |
| 28.12.2023 02:00 - 03:00 | 70 | -20 | 0 | 0 |
| 28.12.2023 03:00 - 04:00 | 70 | -20 | 0 | 0 |
| 28.12.2023 04:00 - 05:00 | 70 | -20 | 0 | 0 |
| 28.12.2023 05:00 - 06:00 | 70 | -20 | 0 | 0 |
| 28.12.2023 06:00 - 07:00 | 0 | 0 | 0 | 0 |
| 28.12.2023 07:00 - 08:00 | 0 | 0 | 0 | 0 |
| 28.12.2023 08:00 - 09:00 | 0 | 0 | 0 | 0 |
| 28.12.2023 09:00 - 10:00 | 0 | 0 | 0 | 0 |
| 28.12.2023 10:00 - 11:00 | 0 | 0 | 0 | 0 |
| 28.12.2023 11:00 - 12:00 | 0 | 0 | 0 | 0 |
| 28.12.2023 12:00 - 13:00 | 0 | 0 | 0 | 0 |
| 28.12.2023 13:00 - 14:00 | 0 | 0 | 0 | 0 |
| 28.12.2023 14:00 - 15:00 | 0 | 0 | 0 | 0 |
| 28.12.2023 15:00 - 16:00 | 0 | 0 | 0 | 0 |
| 28.12.2023 16:00 - 17:00 | 0 | 0 | 0 | 0 |
| 28.12.2023 17:00 - 18:00 | 0 | 0 | 0 | 0 |
| 28.12.2023 18:00 - 19:00 | 0 | 0 | 0 | 0 |
| 28.12.2023 19:00 - 20:00 | 0 | 0 | 0 | 0 |
| 28.12.2023 20:00 - 21:00 | 0 | 0 | 0 | 0 |
| 28.12.2023 21:00 - 22:00 | 0 | 0 | 0 | 0 |
| 28.12.2023 22:00 - 23:00 | 0 | 0 | 0 | 0 |
| 28.12.2023 23:00 - 24:00 | 0 | 0 | 0 | 0 |
| 29.12.2023 00:00 - 01:00 | 0 | 0 | 0 | 0 |
| 29.12.2023 01:00 - 02:00 | 0 | 0 | 0 | 0 |
| 29.12.2023 02:00 - 03:00 | 0 | 0 | 0 | 0 |
| 29.12.2023 03:00 - 04:00 | 0 | 0 | 0 | 0 |
| 29.12.2023 04:00 - 05:00 | 0 | 0 | 0 | 0 |
| 29.12.2023 05:00 - 06:00 | 0 | 0 | 0 | 0 |
| 29.12.2023 06:00 - 07:00 | 0 | 0 | 0 | 0 |
| 29.12.2023 07:00 - 08:00 | 0 | 0 | 0 | 0 |
| 29.12.2023 08:00 - 09:00 | 0 | 0 | 0 | 0 |
| 29.12.2023 09:00 - 10:00 | 0 | 0 | 0 | 0 |
| 29.12.2023 10:00 - 11:00 | 0 | 0 | 0 | 0 |
| 29.12.2023 11:00 - 12:00 | 0 | 0 | 0 | 0 |
| 29.12.2023 12:00 - 13:00 | 0 | 0 | 0 | 0 |
| 29.12.2023 13:00 - 14:00 | 0 | 0 | 0 | 0 |
| 29.12.2023 14:00 - 15:00 | 0 | 0 | 0 | 0 |
| 29.12.2023 15:00 - 16:00 | 0 | 0 | 0 | 0 |
| 29.12.2023 16:00 - 17:00 | 0 | 0 | 0 | 0 |
| 29.12.2023 17:00 - 18:00 | 0 | 0 | 0 | 0 |
| 29.12.2023 18:00 - 19:00 | 0 | 0 | 0 | 0 |
| 29.12.2023 19:00 - 20:00 | 0 | 0 | 0 | 0 |
| 29.12.2023 20:00 - 21:00 | 0 | 0 | 0 | 0 |
| 29.12.2023 21:00 - 22:00 | 0 | 0 | 0 | 0 |
| 29.12.2023 22:00 - 23:00 | 0 | 0 | 0 | 0 |
| 29.12.2023 23:00 - 24:00 | 0 | 0 | 0 | 0 |
| 30.12.2023 00:00 - 01:00 | 0 | 0 | 0 | 0 |
| 30.12.2023 01:00 - 02:00 | 0 | 0 | 0 | 0 |
| 30.12.2023 02:00 - 03:00 | 0 | 0 | 0 | 0 |
| 30.12.2023 03:00 - 04:00 | 0 | 0 | 0 | 0 |
| 30.12.2023 04:00 - 05:00 | 0 | 0 | 0 | 0 |
| 30.12.2023 05:00 - 06:00 | 0 | 0 | 0 | 0 |
| 30.12.2023 06:00 - 07:00 | 0 | 0 | 0 | 0 |
| 30.12.2023 07:00 - 08:00 | 0 | 0 | 0 | 0 |
| 30.12.2023 08:00 - 09:00 | 0 | 0 | 0 | 0 |
| 30.12.2023 09:00 - 10:00 | 0 | 0 | 0 | 0 |
| 30.12.2023 10:00 - 11:00 | 0 | 0 | 0 | 0 |
| 30.12.2023 11:00 - 12:00 | 0 | 0 | 0 | 0 |
| 30.12.2023 12:00 - 13:00 | 0 | 0 | 0 | 0 |
| 30.12.2023 13:00 - 14:00 | 0 | 0 | 0 | 0 |
| 30.12.2023 14:00 - 15:00 | 0 | 0 | 0 | 0 |
| 30.12.2023 15:00 - 16:00 | 0 | 0 | 0 | 0 |
| 30.12.2023 16:00 - 17:00 | 0 | 0 | 0 | 0 |
| 30.12.2023 17:00 - 18:00 | 0 | 0 | 0 | 0 |
| 30.12.2023 18:00 - 19:00 | 0 | 0 | 0 | 0 |
| 30.12.2023 19:00 - 20:00 | 0 | 0 | 0 | 0 |
| 30.12.2023 20:00 - 21:00 | 0 | 0 | 0 | 0 |
| 30.12.2023 21:00 - 22:00 | 0 | 0 | 0 | 0 |
| 30.12.2023 22:00 - 23:00 | 0 | 0 | 0 | 0 |
| 30.12.2023 23:00 - 24:00 | 100 | 0 | 0 | 0 |
| 31.12.2023 00:00 - 01:00 | 100 | 0 | 0 | 0 |
| 31.12.2023 01:00 - 02:00 | 250 | 0 | 0 | 0 |
| 31.12.2023 02:00 - 03:00 | 250 | 0 | 0 | 0 |
| 31.12.2023 03:00 - 04:00 | 250 | 0 | 0 | 0 |
| 31.12.2023 04:00 - 05:00 | 250 | 0 | 0 | 0 |
| 31.12.2023 05:00 - 06:00 | 250 | 0 | 0 | 0 |
| 31.12.2023 06:00 - 07:00 | 0 | 0 | 0 | 0 |
| 31.12.2023 07:00 - 08:00 | 0 | 0 | 0 | 0 |
| 31.12.2023 08:00 - 09:00 | 0 | 0 | 0 | 0 |
| 31.12.2023 09:00 - 10:00 | 0 | 0 | 0 | 0 |
| 31.12.2023 10:00 - 11:00 | 0 | 0 | 0 | 0 |
| 31.12.2023 11:00 - 12:00 | 0 | 0 | 0 | 0 |
| 31.12.2023 12:00 - 13:00 | 0 | 0 | 0 | 0 |
| 31.12.2023 13:00 - 14:00 | 0 | 0 | 0 | 0 |
| 31.12.2023 14:00 - 15:00 | 0 | 0 | 0 | 0 |
| 31.12.2023 15:00 - 16:00 | 0 | 0 | 0 | 0 |
| 31.12.2023 16:00 - 17:00 | 0 | 0 | 0 | 0 |
| 31.12.2023 17:00 - 18:00 | 0 | 0 | 0 | 0 |
| 31.12.2023 18:00 - 19:00 | 0 | 0 | 0 | 0 |
| 31.12.2023 19:00 - 20:00 | 0 | 0 | 0 | 0 |
| 31.12.2023 20:00 - 21:00 | 0 | 0 | 0 | 0 |
| 31.12.2023 21:00 - 22:00 | 0 | 0 | 0 | 0 |
| 31.12.2023 22:00 - 23:00 | 0 | 0 | 0 | 0 |
| 31.12.2023 23:00 - 24:00 | 0 | 0 | 0 | 0 |
| 01.01.2024 00:00 - 01:00 | 0 | 0 | 0 | 0 |
| 01.01.2024 01:00 - 02:00 | 0 | 0 | 0 | 0 |
| 01.01.2024 02:00 - 03:00 | 0 | 0 | 0 | 0 |
| 01.01.2024 03:00 - 04:00 | 0 | 0 | 0 | 0 |
| 01.01.2024 04:00 - 05:00 | 0 | 0 | 0 | 0 |
| 01.01.2024 05:00 - 06:00 | 0 | 0 | 0 | 0 |